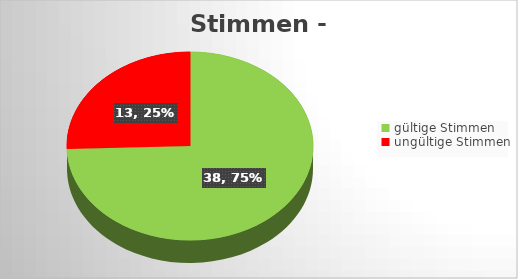
| Category | Series 0 |
|---|---|
| gültige Stimmen | 38 |
| ungültige Stimmen | 13 |